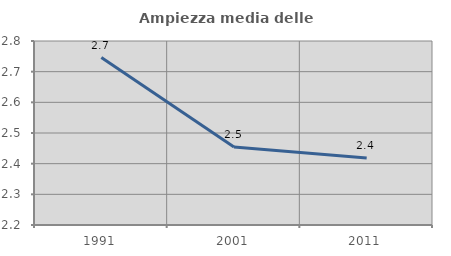
| Category | Ampiezza media delle famiglie |
|---|---|
| 1991.0 | 2.746 |
| 2001.0 | 2.454 |
| 2011.0 | 2.418 |